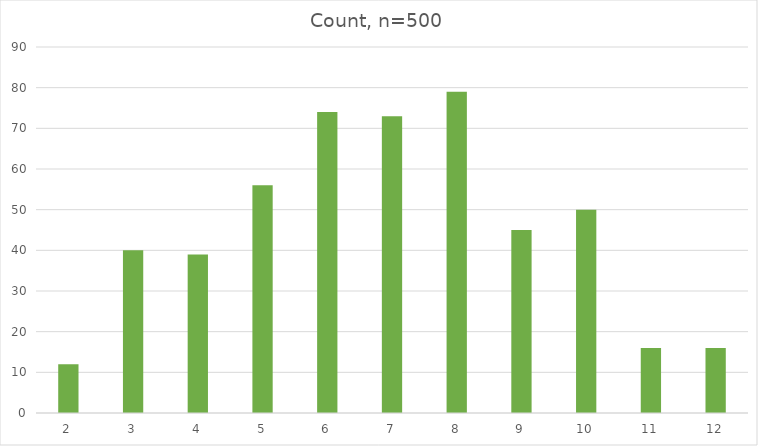
| Category | Count, n=500 |
|---|---|
| 2.0 | 12 |
| 3.0 | 40 |
| 4.0 | 39 |
| 5.0 | 56 |
| 6.0 | 74 |
| 7.0 | 73 |
| 8.0 | 79 |
| 9.0 | 45 |
| 10.0 | 50 |
| 11.0 | 16 |
| 12.0 | 16 |